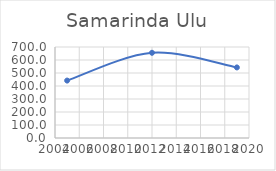
| Category | Series 0 |
|---|---|
| 2005.0 | 441.748 |
| 2012.0 | 655.457 |
| 2019.0 | 542.818 |